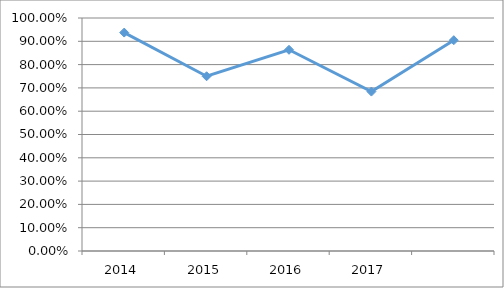
| Category | PACO-I5O01 |
|---|---|
| 2014.0 | 0.938 |
| 2015.0 | 0.75 |
| 2016.0 | 0.864 |
| 2017.0 | 0.684 |